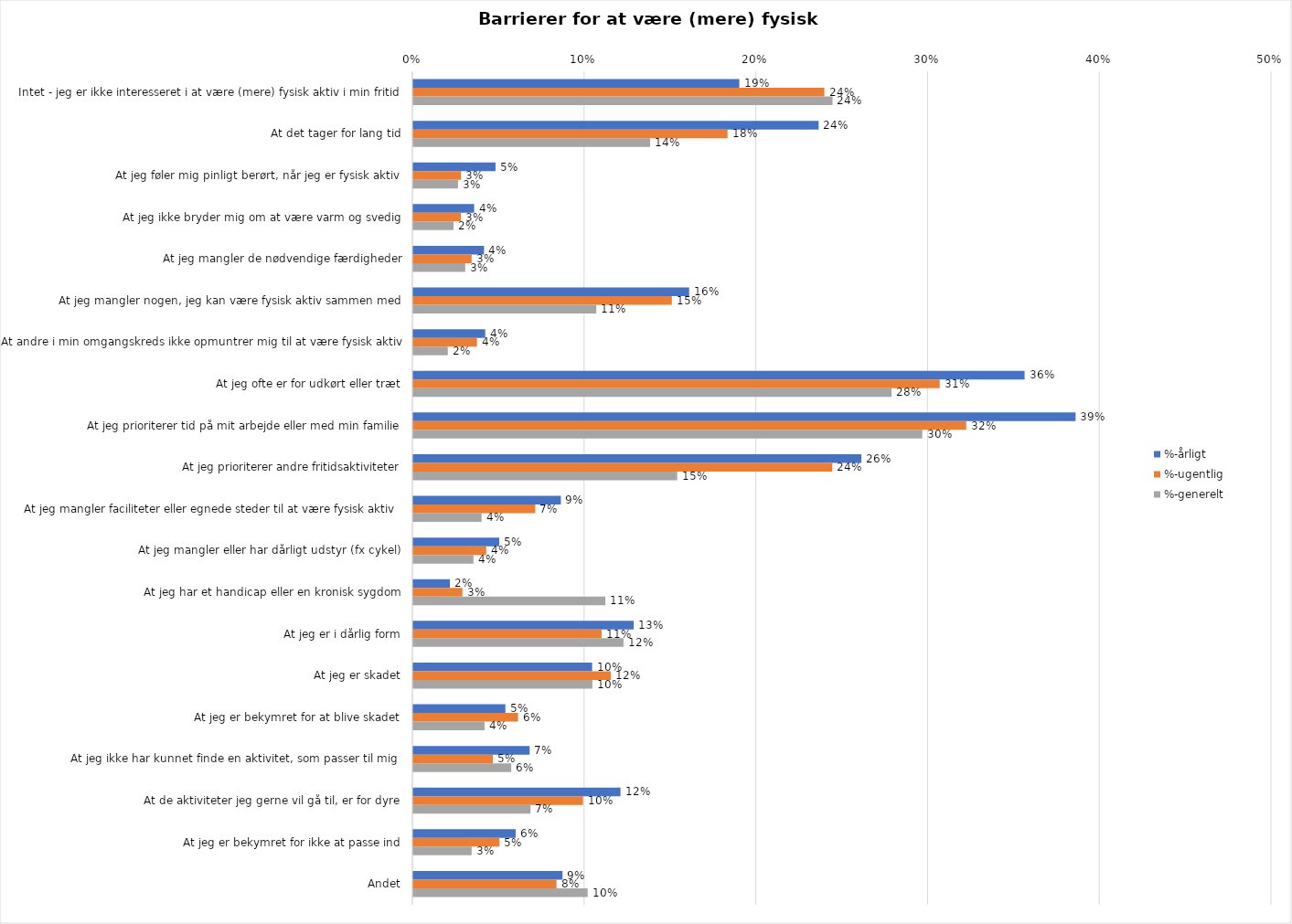
| Category | %-årligt | %-ugentlig | %-generelt |
|---|---|---|---|
| Intet - jeg er ikke interesseret i at være (mere) fysisk aktiv i min fritid | 0.19 | 0.239 | 0.244 |
| At det tager for lang tid | 0.236 | 0.183 | 0.138 |
| At jeg føler mig pinligt berørt, når jeg er fysisk aktiv | 0.048 | 0.028 | 0.026 |
| At jeg ikke bryder mig om at være varm og svedig | 0.035 | 0.028 | 0.023 |
| At jeg mangler de nødvendige færdigheder | 0.041 | 0.034 | 0.03 |
| At jeg mangler nogen, jeg kan være fysisk aktiv sammen med | 0.161 | 0.151 | 0.107 |
| At andre i min omgangskreds ikke opmuntrer mig til at være fysisk aktiv | 0.042 | 0.037 | 0.02 |
| At jeg ofte er for udkørt eller træt | 0.356 | 0.307 | 0.279 |
| At jeg prioriterer tid på mit arbejde eller med min familie | 0.386 | 0.322 | 0.296 |
| At jeg prioriterer andre fritidsaktiviteter | 0.261 | 0.244 | 0.154 |
| At jeg mangler faciliteter eller egnede steder til at være fysisk aktiv  | 0.086 | 0.071 | 0.04 |
| At jeg mangler eller har dårligt udstyr (fx cykel) | 0.05 | 0.042 | 0.035 |
| At jeg har et handicap eller en kronisk sygdom | 0.021 | 0.029 | 0.112 |
| At jeg er i dårlig form | 0.128 | 0.11 | 0.122 |
| At jeg er skadet | 0.104 | 0.115 | 0.104 |
| At jeg er bekymret for at blive skadet | 0.054 | 0.061 | 0.041 |
| At jeg ikke har kunnet finde en aktivitet, som passer til mig  | 0.068 | 0.046 | 0.057 |
| At de aktiviteter jeg gerne vil gå til, er for dyre | 0.121 | 0.099 | 0.068 |
| At jeg er bekymret for ikke at passe ind | 0.06 | 0.05 | 0.034 |
| Andet | 0.087 | 0.083 | 0.102 |